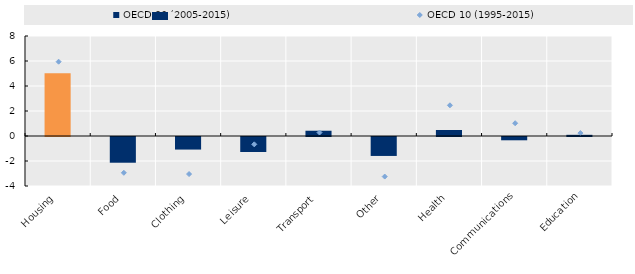
| Category | OECD 20 (2005-2015) |
|---|---|
| Housing | 5.021 |
| Food | -2.058 |
| Clothing | -1.005 |
| Leisure | -1.2 |
| Transport | 0.421 |
| Other | -1.516 |
| Health | 0.479 |
| Communications | -0.263 |
| Education | 0.095 |